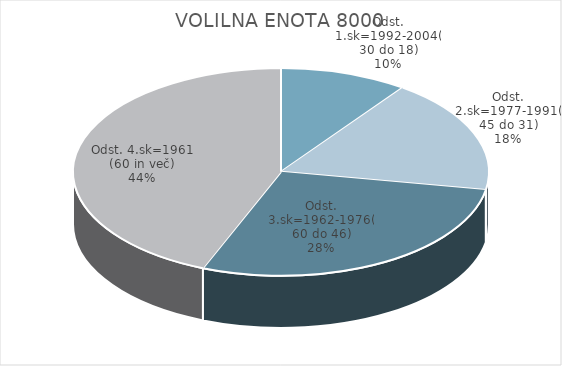
| Category | VOLILNA ENOTA 8000 |
|---|---|
| Odst. 1.sk=1992-2004(30 do 18) | 3.6 |
| Odst. 2.sk=1977-1991(45 do 31) | 6.46 |
| Odst. 3.sk=1962-1976(60 do 46) | 10.25 |
| Odst. 4.sk=1961 (60 in več) | 15.88 |